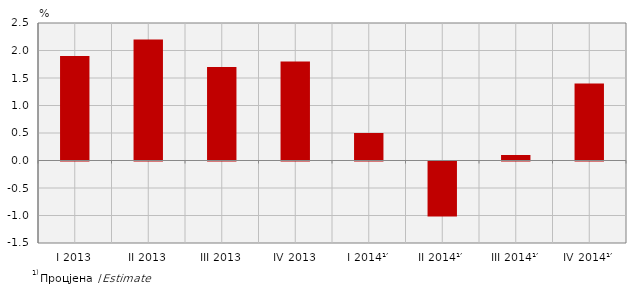
| Category | Стопе реалног раста БДП-а
Real growth rates of GDP |
|---|---|
| I 2013 | 1.9 |
| II 2013 | 2.2 |
| III 2013 | 1.7 |
| IV 2013 | 1.8 |
| I 2014¹′ | 0.5 |
| II 2014¹′ | -1 |
| III 2014¹′ | 0.1 |
| IV 2014¹′ | 1.4 |